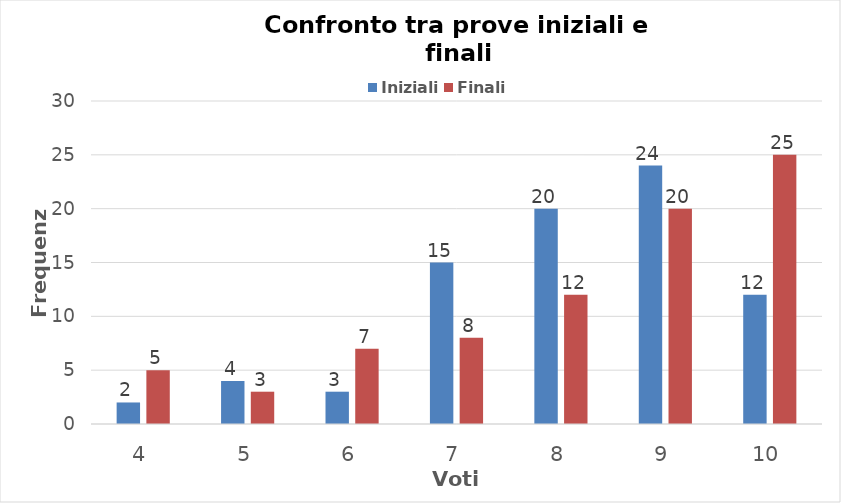
| Category | Iniziali | Finali |
|---|---|---|
| 4.0 | 2 | 5 |
| 5.0 | 4 | 3 |
| 6.0 | 3 | 7 |
| 7.0 | 15 | 8 |
| 8.0 | 20 | 12 |
| 9.0 | 24 | 20 |
| 10.0 | 12 | 25 |